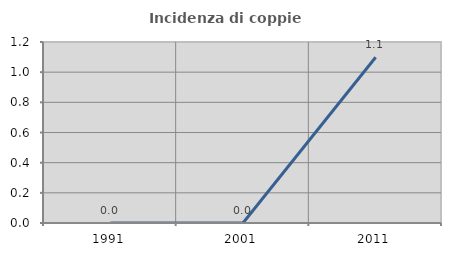
| Category | Incidenza di coppie miste |
|---|---|
| 1991.0 | 0 |
| 2001.0 | 0 |
| 2011.0 | 1.099 |